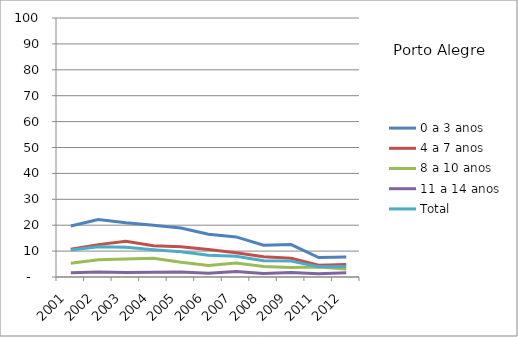
| Category | 0 a 3 anos | 4 a 7 anos | 8 a 10 anos | 11 a 14 anos | Total |
|---|---|---|---|---|---|
| 2001.0 | 19.69 | 10.74 | 5.27 | 1.63 | 10.41 |
| 2002.0 | 22.21 | 12.5 | 6.66 | 1.9 | 11.72 |
| 2003.0 | 20.96 | 13.81 | 6.97 | 1.78 | 11.52 |
| 2004.0 | 19.99 | 12.06 | 7.24 | 1.88 | 10.55 |
| 2005.0 | 18.9 | 11.72 | 5.66 | 1.97 | 9.77 |
| 2006.0 | 16.51 | 10.66 | 4.42 | 1.42 | 8.37 |
| 2007.0 | 15.48 | 9.36 | 5.37 | 2.12 | 8.01 |
| 2008.0 | 12.24 | 7.81 | 4.08 | 1.39 | 6.29 |
| 2009.0 | 12.52 | 7.22 | 3.66 | 1.76 | 6.13 |
| 2011.0 | 7.49 | 4.54 | 3.83 | 1.28 | 3.97 |
| 2012.0 | 7.71 | 4.86 | 3.04 | 1.63 | 4.04 |